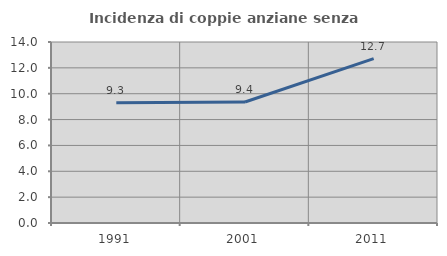
| Category | Incidenza di coppie anziane senza figli  |
|---|---|
| 1991.0 | 9.302 |
| 2001.0 | 9.357 |
| 2011.0 | 12.717 |